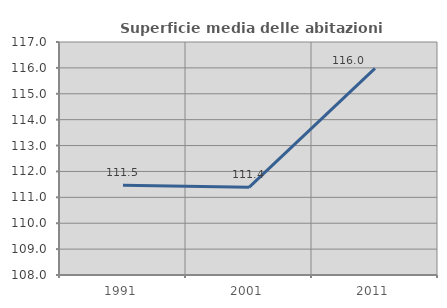
| Category | Superficie media delle abitazioni occupate |
|---|---|
| 1991.0 | 111.469 |
| 2001.0 | 111.386 |
| 2011.0 | 115.984 |